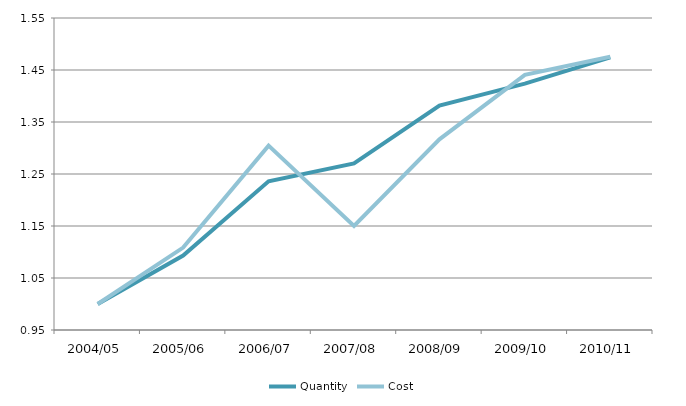
| Category | Quantity | Cost |
|---|---|---|
| 2004/05 | 1 | 1 |
| 2005/06 | 1.093 | 1.109 |
| 2006/07 | 1.236 | 1.305 |
| 2007/08 | 1.27 | 1.15 |
| 2008/09 | 1.382 | 1.317 |
| 2009/10 | 1.424 | 1.441 |
| 2010/11 | 1.474 | 1.476 |